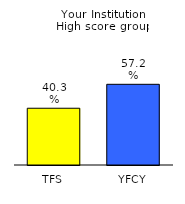
| Category | Series 0 |
|---|---|
| TFS | 0.403 |
| YFCY | 0.572 |